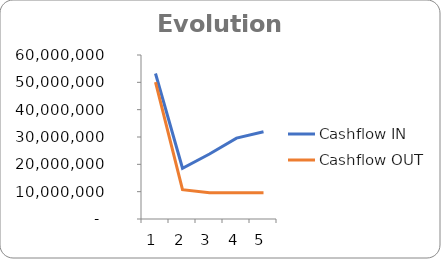
| Category | Cashflow IN | Cashflow OUT |
|---|---|---|
| 0 | 53229725.333 | 50040681.442 |
| 1 | 18563501.891 | 10740681.442 |
| 2 | 23757965.313 | 9627323.117 |
| 3 | 29580780.927 | 9627323.117 |
| 4 | 31935492.092 | 9627323.117 |